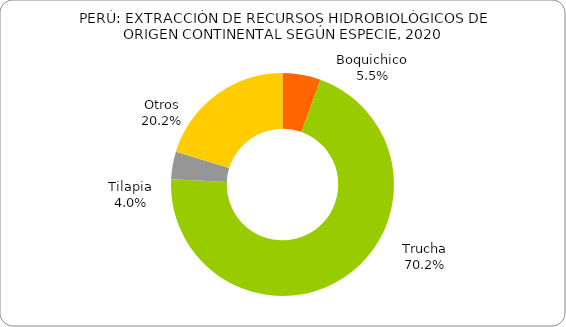
| Category | Series 0 |
|---|---|
| Boquichico | 0.055 |
| Trucha | 0.702 |
| Tilapia | 0.04 |
| Otros | 0.202 |